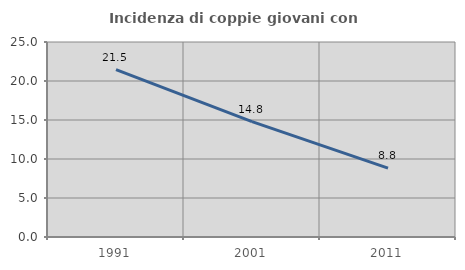
| Category | Incidenza di coppie giovani con figli |
|---|---|
| 1991.0 | 21.47 |
| 2001.0 | 14.794 |
| 2011.0 | 8.829 |